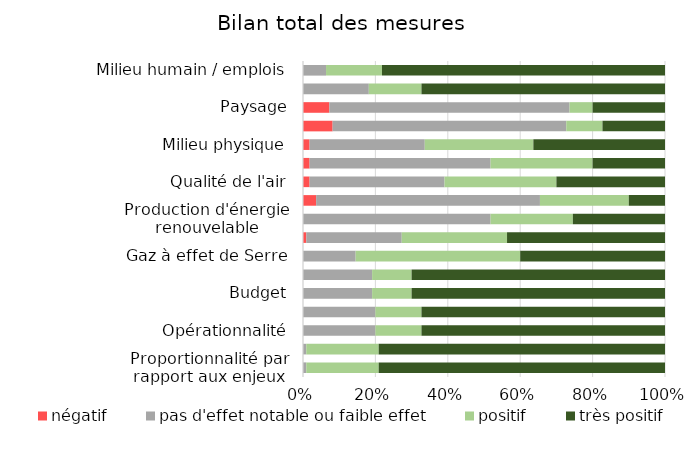
| Category | négatif | pas d'effet notable ou faible effet | positif | très positif |
|---|---|---|---|---|
| Proportionnalité par rapport aux enjeux | 0 | 1 | 22 | 87 |
|  | 0 | 0.009 | 0.2 | 0.791 |
| Opérationnalité | 0 | 22 | 14 | 74 |
|  | 0 | 0.2 | 0.127 | 0.673 |
| Budget | 0 | 21 | 12 | 77 |
|  | 0 | 0.191 | 0.109 | 0.7 |
| Gaz à effet de Serre | 0 | 16 | 50 | 44 |
| Consommation d'énergie | 1 | 29 | 32 | 48 |
| Production d'énergie renouvelable | 0 | 57 | 25 | 28 |
| Stockage du Carbone | 4 | 68 | 27 | 11 |
| Qualité de l'air | 2 | 41 | 34 | 33 |
| Adaptation au changement climatique | 2 | 55 | 31 | 22 |
| Milieu physique | 2 | 35 | 33 | 40 |
| Milieu Naturel | 9 | 71 | 11 | 19 |
| Paysage | 8 | 73 | 7 | 22 |
| Milieu humain / cadre de vie et santé | 0 | 20 | 16 | 74 |
| Milieu humain / emplois | 0 | 7 | 17 | 86 |